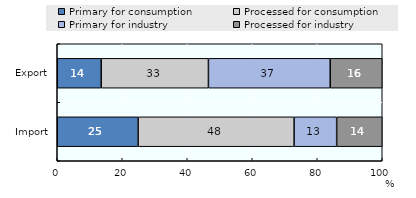
| Category | Primary for consumption | Processed for consumption | Primary for industry | Processed for industry |
|---|---|---|---|---|
| Import | 24.885 | 47.991 | 13.104 | 14.02 |
| Export | 13.526 | 32.99 | 37.479 | 16.005 |